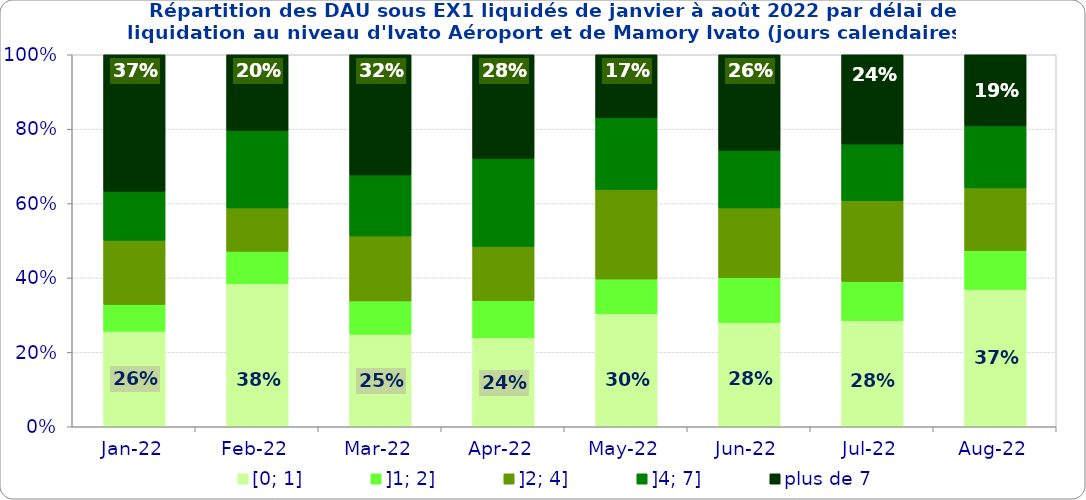
| Category | [0; 1] | ]1; 2] | ]2; 4] | ]4; 7] | plus de 7 |
|---|---|---|---|---|---|
| 2022-01-01 | 0.257 | 0.072 | 0.173 | 0.132 | 0.367 |
| 2022-02-01 | 0.385 | 0.087 | 0.117 | 0.208 | 0.203 |
| 2022-03-01 | 0.249 | 0.089 | 0.174 | 0.164 | 0.323 |
| 2022-04-01 | 0.239 | 0.1 | 0.146 | 0.237 | 0.279 |
| 2022-05-01 | 0.303 | 0.094 | 0.24 | 0.193 | 0.169 |
| 2022-06-01 | 0.281 | 0.121 | 0.187 | 0.155 | 0.257 |
| 2022-07-01 | 0.285 | 0.106 | 0.217 | 0.152 | 0.24 |
| 2022-08-01 | 0.369 | 0.104 | 0.169 | 0.167 | 0.191 |